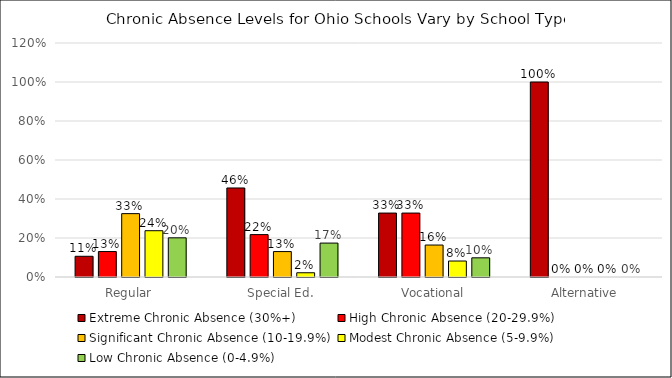
| Category | Extreme Chronic Absence (30%+) | High Chronic Absence (20-29.9%) | Significant Chronic Absence (10-19.9%) | Modest Chronic Absence (5-9.9%) | Low Chronic Absence (0-4.9%) |
|---|---|---|---|---|---|
| Regular | 0.106 | 0.131 | 0.325 | 0.237 | 0.201 |
| Special Ed. | 0.457 | 0.217 | 0.13 | 0.022 | 0.174 |
| Vocational | 0.328 | 0.328 | 0.164 | 0.082 | 0.098 |
| Alternative | 1 | 0 | 0 | 0 | 0 |